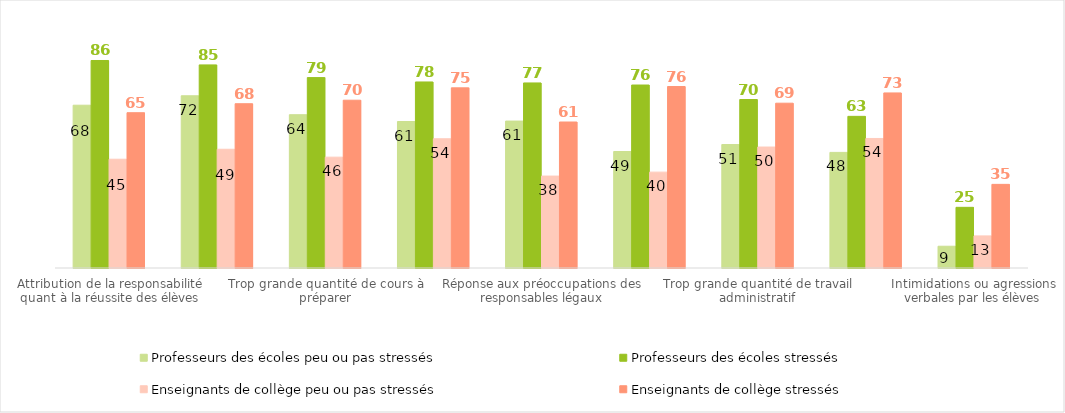
| Category | Professeurs des écoles peu ou pas stressés | Professeurs des écoles stressés | Enseignants de collège peu ou pas stressés | Enseignants de collège stressés |
|---|---|---|---|---|
| Attribution de la responsabilité quant à la réussite des élèves | 67.827 | 86.461 | 45.324 | 64.706 |
| Adaptation des cours pour les élèves ayant des besoins éducatifs particuliers | 71.758 | 84.624 | 49.476 | 68.444 |
| Trop grande quantité de cours à préparer | 63.868 | 79.334 | 46.183 | 69.915 |
| Respect des nouvelles exigences institutionnelles | 61.037 | 77.516 | 53.85 | 75.06 |
| Réponse aux préoccupations des responsables légaux | 61.223 | 77.108 | 38.304 | 60.832 |
| Maintien de la discipline | 48.538 | 76.24 | 39.945 | 75.618 |
| Trop grande quantité de travail administratif | 51.435 | 70.2 | 50.405 | 68.669 |
| Trop grande quantité de devoirs à corriger | 48.165 | 63.185 | 53.966 | 72.945 |
| Intimidations ou agressions verbales par les élèves | 9.068 | 25.276 | 13.371 | 34.85 |